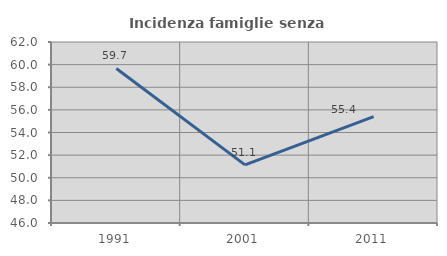
| Category | Incidenza famiglie senza nuclei |
|---|---|
| 1991.0 | 59.659 |
| 2001.0 | 51.136 |
| 2011.0 | 55.405 |